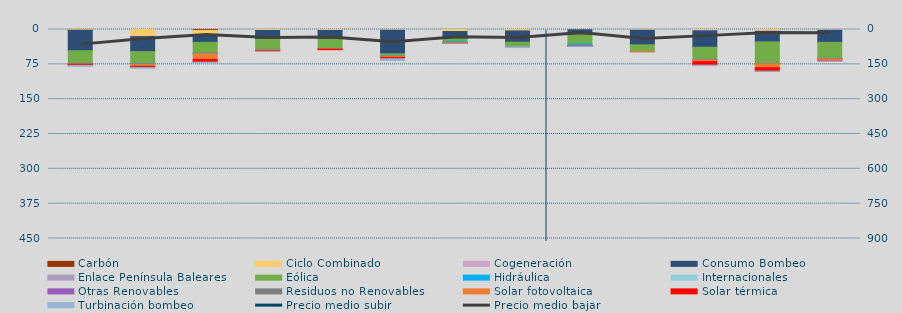
| Category | Carbón | Ciclo Combinado | Cogeneración | Consumo Bombeo | Enlace Península Baleares | Eólica | Hidráulica | Internacionales | Otras Renovables | Residuos no Renovables | Solar fotovoltaica | Solar térmica | Turbinación bombeo |
|---|---|---|---|---|---|---|---|---|---|---|---|---|---|
| 0 | 543 | 1288.6 | 238.655 | 43678.268 | 0 | 27098.515 | 150.455 | 0 | 982.208 | 13.2 | 761.432 | 2474.8 | 2164.5 |
| 1 | 0 | 14634.199 | 838.098 | 32075.867 | 0 | 26340.743 | 533.073 | 0 | 507.085 | 0 | 4421.722 | 2509.099 | 1924.625 |
| 2 | 1932.082 | 9683.392 | 448.406 | 15579.715 | 0 | 23351.965 | 345.088 | 0 | 633.184 | 108.783 | 12157.29 | 6064.342 | 913.05 |
| 3 | 0 | 2088.417 | 56.138 | 18984.933 | 0 | 23010.334 | 40.779 | 0 | 39.002 | 82.474 | 1741.959 | 1100.186 | 17.7 |
| 4 | 20 | 1489.042 | 599.786 | 18456.273 | 0 | 20881.86 | 87.748 | 0 | 304.724 | 12.55 | 573.462 | 1034.589 | 0 |
| 5 | 0 | 1431.5 | 183.958 | 50768.847 | 0 | 5100.208 | 273.474 | 0 | 90.045 | 0 | 2259.405 | 2752.042 | 3910.508 |
| 6 | 0 | 4345.9 | 27.314 | 15616.296 | 0 | 6806.453 | 2149.971 | 0 | 152.334 | 42.654 | 44.067 | 19 | 204.333 |
| 7 | 0 | 3059.067 | 0 | 24243.492 | 0 | 10425.232 | 13.796 | 0 | 0 | 0 | 9.194 | 0 | 1113.3 |
| 8 | 0 | 0 | 655.675 | 11045.084 | 0 | 19430.531 | 3297.137 | 0 | 1221.2 | 4.575 | 380.934 | 279.19 | 100 |
| 9 | 0 | 1578.425 | 97.391 | 31105.358 | 0 | 14760.555 | 0.525 | 0 | 6.9 | 0 | 610.128 | 0 | 0 |
| 10 | 0 | 1682.35 | 1288.318 | 35237.998 | 0 | 26715.501 | 538.936 | 0 | 327.466 | 97.457 | 3459.795 | 7401.339 | 450.583 |
| 11 | 0 | 2896.525 | 1320.794 | 22481.384 | 0 | 46423.207 | 245.293 | 0 | 655.227 | 248.362 | 8080.179 | 7222.305 | 292.5 |
| 12 | 0 | 199.85 | 1687.618 | 25714.166 | 0 | 34475.114 | 354.461 | 0 | 851.955 | 108.267 | 3215.484 | 949.057 | 183.208 |